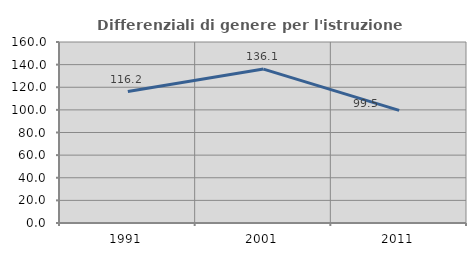
| Category | Differenziali di genere per l'istruzione superiore |
|---|---|
| 1991.0 | 116.165 |
| 2001.0 | 136.053 |
| 2011.0 | 99.522 |